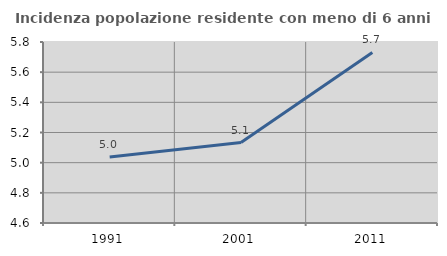
| Category | Incidenza popolazione residente con meno di 6 anni |
|---|---|
| 1991.0 | 5.038 |
| 2001.0 | 5.133 |
| 2011.0 | 5.731 |